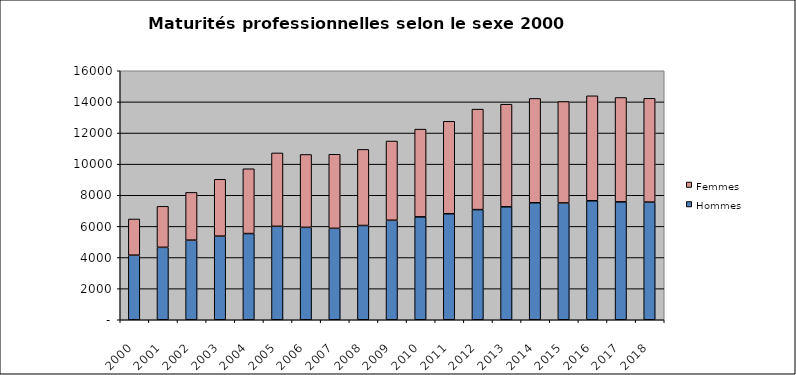
| Category | Hommes | Femmes |
|---|---|---|
| 2000.0 | 4151 | 2324 |
| 2001.0 | 4654 | 2635 |
| 2002.0 | 5116 | 3069 |
| 2003.0 | 5374 | 3653 |
| 2004.0 | 5539 | 4164 |
| 2005.0 | 6005 | 4714 |
| 2006.0 | 5938 | 4683 |
| 2007.0 | 5875 | 4759 |
| 2008.0 | 6058 | 4888 |
| 2009.0 | 6394 | 5091 |
| 2010.0 | 6612 | 5637 |
| 2011.0 | 6813 | 5940 |
| 2012.0 | 7077 | 6457 |
| 2013.0 | 7258 | 6592 |
| 2014.0 | 7518 | 6704 |
| 2015.0 | 7507 | 6516 |
| 2016.0 | 7646 | 6745 |
| 2017.0 | 7577 | 6707 |
| 2018.0 | 7561 | 6667 |